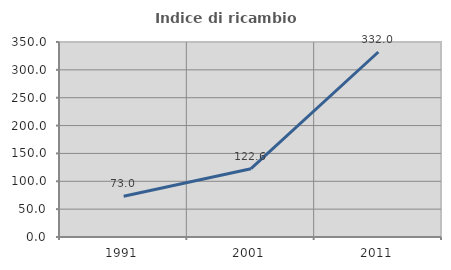
| Category | Indice di ricambio occupazionale  |
|---|---|
| 1991.0 | 73.027 |
| 2001.0 | 122.621 |
| 2011.0 | 332.032 |